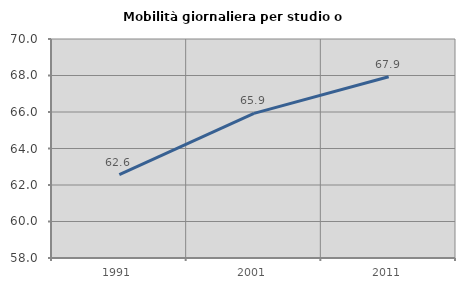
| Category | Mobilità giornaliera per studio o lavoro |
|---|---|
| 1991.0 | 62.568 |
| 2001.0 | 65.923 |
| 2011.0 | 67.934 |